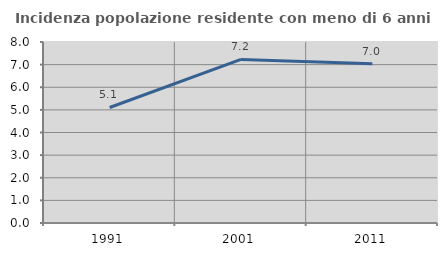
| Category | Incidenza popolazione residente con meno di 6 anni |
|---|---|
| 1991.0 | 5.106 |
| 2001.0 | 7.228 |
| 2011.0 | 7.042 |